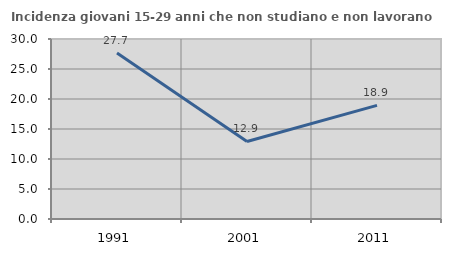
| Category | Incidenza giovani 15-29 anni che non studiano e non lavorano  |
|---|---|
| 1991.0 | 27.66 |
| 2001.0 | 12.922 |
| 2011.0 | 18.934 |